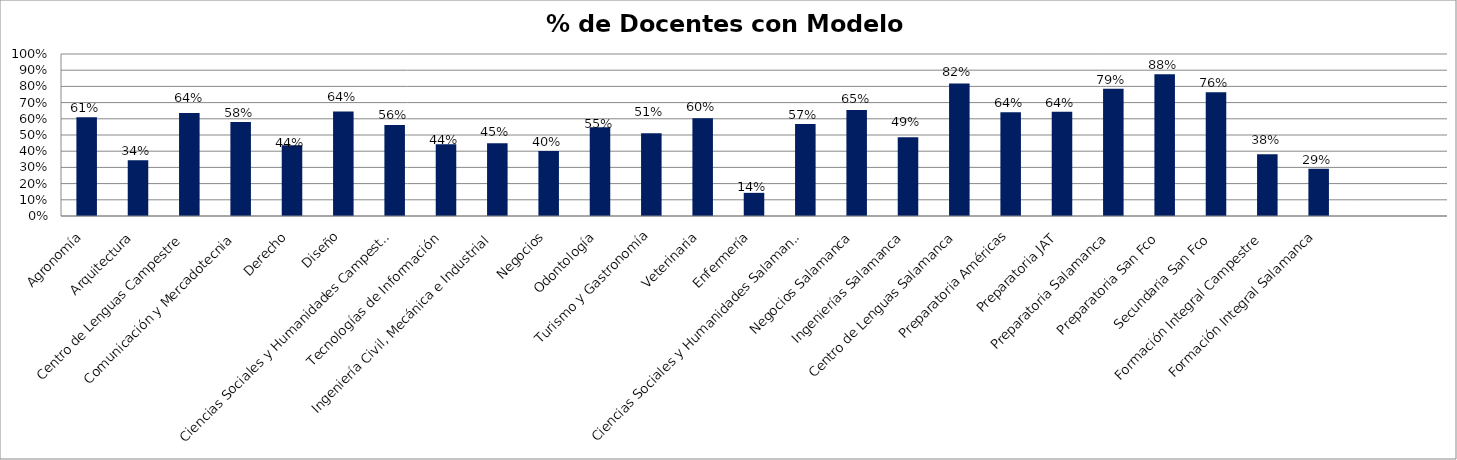
| Category | Series 1 |
|---|---|
| Agronomía | 0.61 |
| Arquitectura | 0.344 |
| Centro de Lenguas Campestre | 0.636 |
| Comunicación y Mercadotecnia | 0.58 |
| Derecho | 0.438 |
| Diseño | 0.645 |
| Ciencias Sociales y Humanidades Campestre | 0.562 |
| Tecnologías de Información | 0.443 |
| Ingeniería Civil, Mecánica e Industrial | 0.449 |
| Negocios | 0.402 |
| Odontología | 0.548 |
| Turismo y Gastronomía | 0.511 |
| Veterinaria | 0.604 |
| Enfermería | 0.143 |
| Ciencias Sociales y Humanidades Salamanca | 0.569 |
| Negocios Salamanca | 0.654 |
| Ingenierías Salamanca | 0.486 |
| Centro de Lenguas Salamanca | 0.818 |
| Preparatoria Américas | 0.641 |
| Preparatoria JAT | 0.643 |
| Preparatoria Salamanca | 0.786 |
| Preparatoria San Fco | 0.875 |
| Secundaria San Fco | 0.763 |
| Formación Integral Campestre | 0.382 |
| Formación Integral Salamanca | 0.292 |